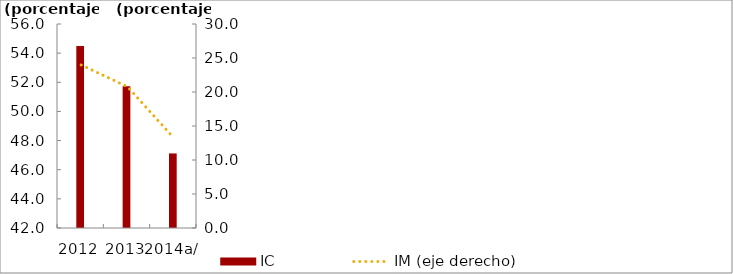
| Category | IC |
|---|---|
| 2012 | 54.492 |
| 2013 | 51.736 |
| 2014a/ | 47.117 |